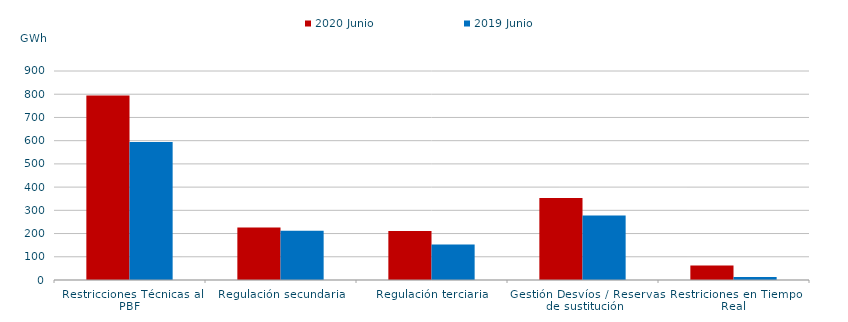
| Category | 2020 Junio | 2019 Junio |
|---|---|---|
| Restricciones Técnicas al PBF | 794.277 | 593.858 |
| Regulación secundaria | 225.893 | 211.786 |
| Regulación terciaria | 210.781 | 152.426 |
| Gestión Desvíos / Reservas de sustitución | 353.587 | 277.415 |
| Restriciones en Tiempo Real | 62.657 | 12.579 |